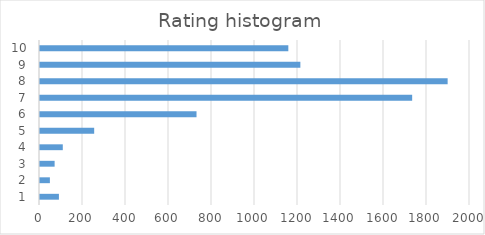
| Category | users |
|---|---|
| 1.0 | 88 |
| 2.0 | 46 |
| 3.0 | 68 |
| 4.0 | 106 |
| 5.0 | 252 |
| 6.0 | 728 |
| 7.0 | 1731 |
| 8.0 | 1896 |
| 9.0 | 1211 |
| 10.0 | 1155 |